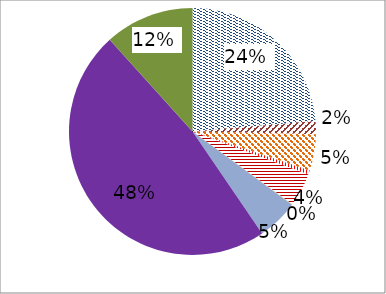
| Category | Series 0 |
|---|---|
| Fixed-line phone | 1144317733 |
| Cable Modem | 81458450 |
| DSL | 231336827 |
| FTTH/B | 25384522 |
| Other Internet | 212707347 |
| 1G mobile analog  | 2739747 |
| 2 G mobile | 260020905 |
| 2.5G mobile | 2314094393 |
| 3G mobile | 565441708 |